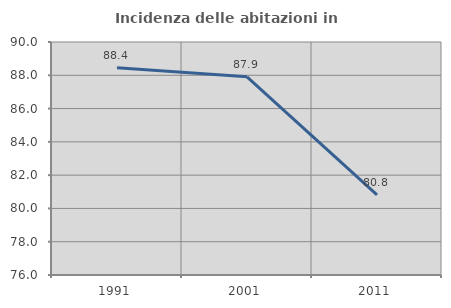
| Category | Incidenza delle abitazioni in proprietà  |
|---|---|
| 1991.0 | 88.448 |
| 2001.0 | 87.906 |
| 2011.0 | 80.813 |